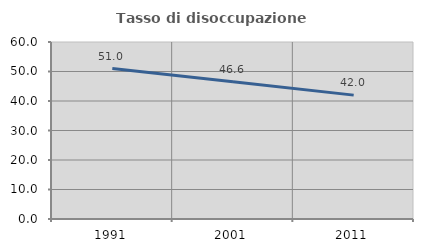
| Category | Tasso di disoccupazione giovanile  |
|---|---|
| 1991.0 | 51.006 |
| 2001.0 | 46.553 |
| 2011.0 | 41.989 |